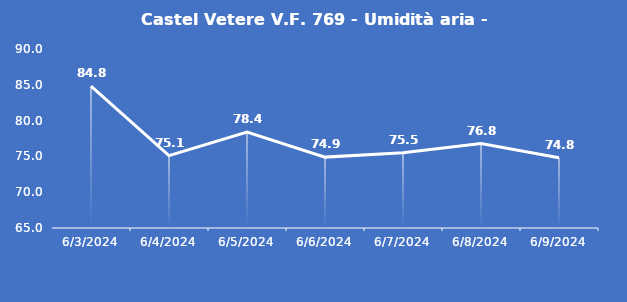
| Category | Castel Vetere V.F. 769 - Umidità aria - Grezzo (%) |
|---|---|
| 6/3/24 | 84.8 |
| 6/4/24 | 75.1 |
| 6/5/24 | 78.4 |
| 6/6/24 | 74.9 |
| 6/7/24 | 75.5 |
| 6/8/24 | 76.8 |
| 6/9/24 | 74.8 |